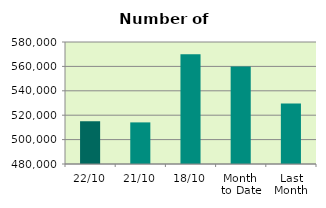
| Category | Series 0 |
|---|---|
| 22/10 | 514950 |
| 21/10 | 514108 |
| 18/10 | 569928 |
| Month 
to Date | 559897.625 |
| Last
Month | 529677.905 |